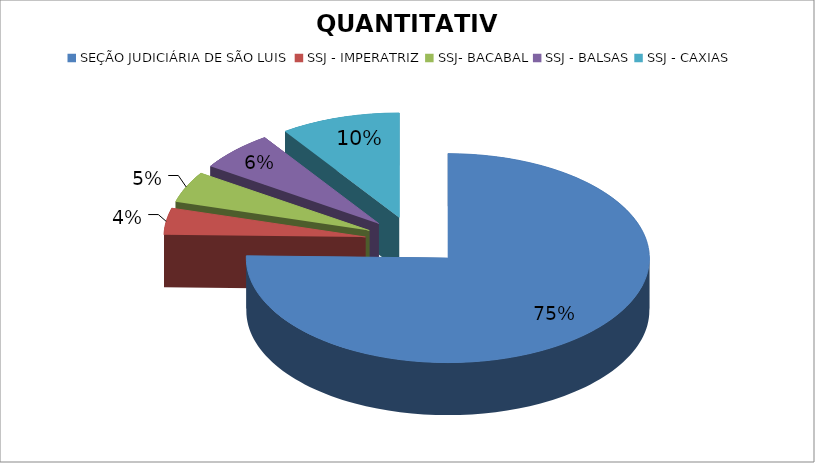
| Category | QUANTITATIVO |
|---|---|
| SEÇÃO JUDICIÁRIA DE SÃO LUIS | 110 |
| SSJ - IMPERATRIZ | 6 |
| SSJ- BACABAL | 7 |
| SSJ - BALSAS | 9 |
| SSJ - CAXIAS | 14 |